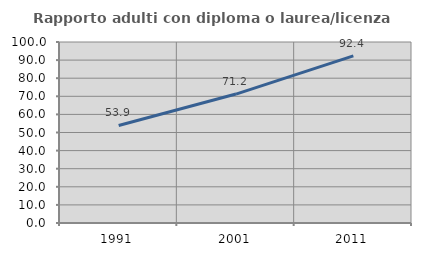
| Category | Rapporto adulti con diploma o laurea/licenza media  |
|---|---|
| 1991.0 | 53.896 |
| 2001.0 | 71.239 |
| 2011.0 | 92.373 |